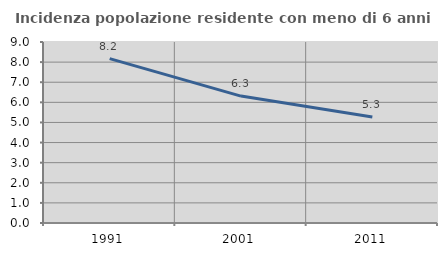
| Category | Incidenza popolazione residente con meno di 6 anni |
|---|---|
| 1991.0 | 8.172 |
| 2001.0 | 6.311 |
| 2011.0 | 5.27 |